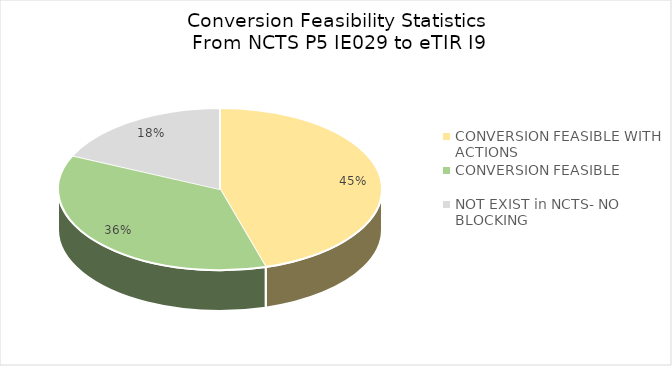
| Category | Total |
|---|---|
| CONVERSION FEASIBLE WITH ACTIONS  | 5 |
| COΝVERSION FEASIBLE | 4 |
| NOT EXIST in NCTS- NO BLOCKING | 2 |